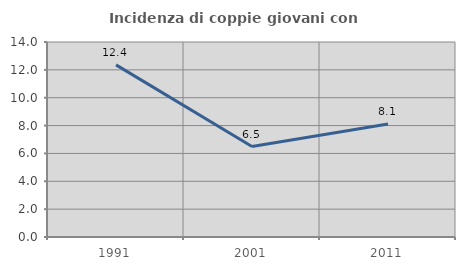
| Category | Incidenza di coppie giovani con figli |
|---|---|
| 1991.0 | 12.36 |
| 2001.0 | 6.497 |
| 2011.0 | 8.116 |